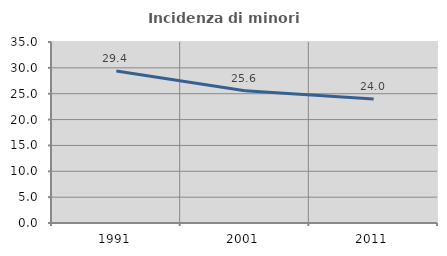
| Category | Incidenza di minori stranieri |
|---|---|
| 1991.0 | 29.412 |
| 2001.0 | 25.564 |
| 2011.0 | 23.984 |